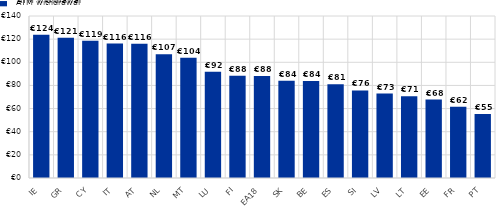
| Category | ATM withdrawal |
|---|---|
| IE | 123.7 |
| GR | 121.3 |
| CY | 118.6 |
| IT | 116.2 |
| AT | 116 |
| NL | 106.9 |
| MT | 104 |
| LU | 91.8 |
| FI | 88.4 |
| EA18 | 88.2 |
| SK | 84.1 |
| BE | 83.9 |
| ES | 81 |
| SI | 75.7 |
| LV | 73 |
| LT | 70.7 |
| EE | 67.8 |
| FR | 61.6 |
| PT | 55.3 |